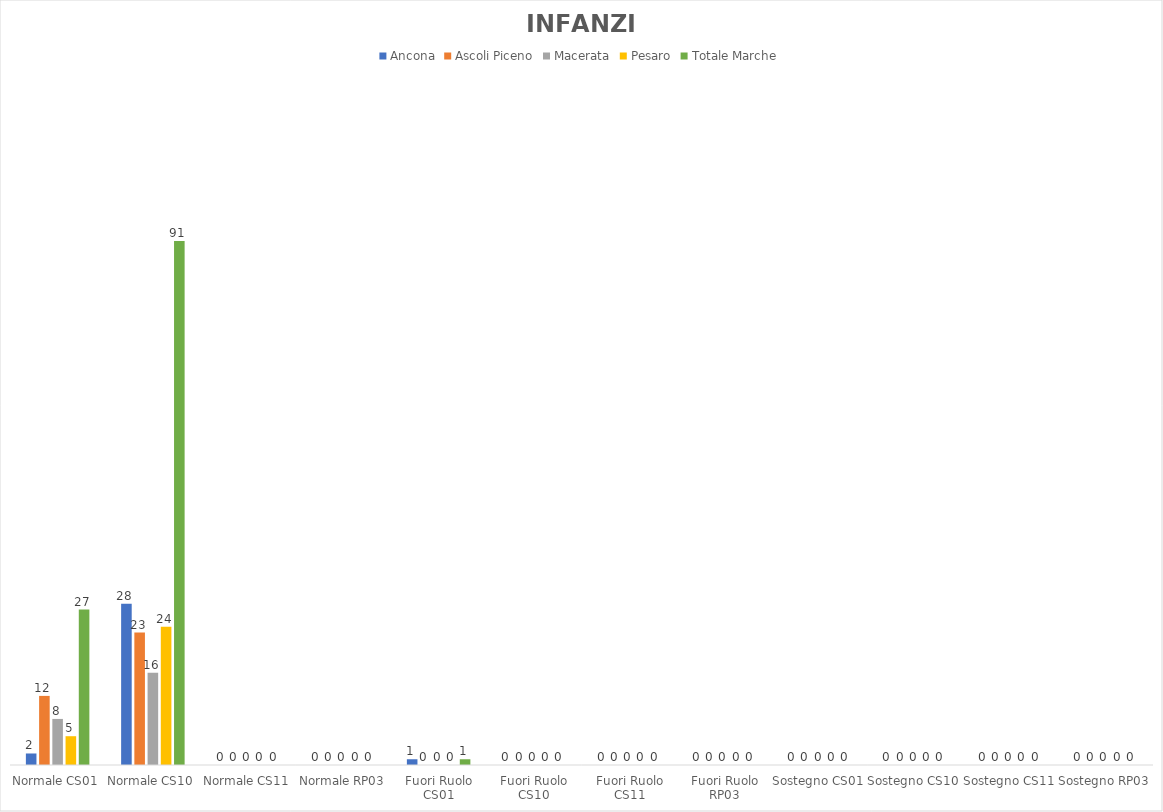
| Category | Ancona | Ascoli Piceno | Macerata | Pesaro | Totale Marche |
|---|---|---|---|---|---|
| Normale CS01 | 2 | 12 | 8 | 5 | 27 |
| Normale CS10 | 28 | 23 | 16 | 24 | 91 |
| Normale CS11 | 0 | 0 | 0 | 0 | 0 |
| Normale RP03 | 0 | 0 | 0 | 0 | 0 |
| Fuori Ruolo CS01 | 1 | 0 | 0 | 0 | 1 |
| Fuori Ruolo CS10 | 0 | 0 | 0 | 0 | 0 |
| Fuori Ruolo CS11 | 0 | 0 | 0 | 0 | 0 |
| Fuori Ruolo RP03 | 0 | 0 | 0 | 0 | 0 |
| Sostegno CS01 | 0 | 0 | 0 | 0 | 0 |
| Sostegno CS10 | 0 | 0 | 0 | 0 | 0 |
| Sostegno CS11 | 0 | 0 | 0 | 0 | 0 |
| Sostegno RP03 | 0 | 0 | 0 | 0 | 0 |